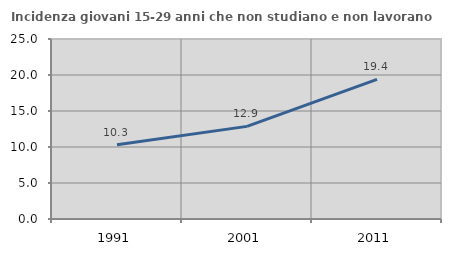
| Category | Incidenza giovani 15-29 anni che non studiano e non lavorano  |
|---|---|
| 1991.0 | 10.306 |
| 2001.0 | 12.866 |
| 2011.0 | 19.385 |